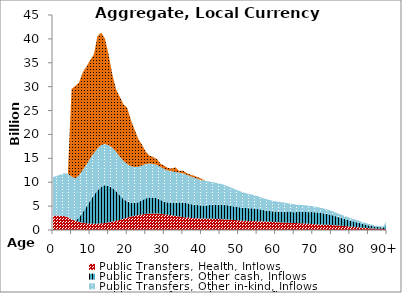
| Category | Public Transfers, Health, Inflows | Public Transfers, Other cash, Inflows | Public Transfers, Other in-kind, Inflows | Public Transfers, Education, Inflows |
|---|---|---|---|---|
| 0 | 2989.538 | 0 | 8076.591 | 0 |
|  | 3045.862 | 0 | 8295.617 | 0 |
| 2 | 2986.964 | 0 | 8597.772 | 0 |
| 3 | 2911.847 | 0 | 8972.659 | 0 |
| 4 | 2665.38 | 0 | 9103.258 | 0 |
| 5 | 2264.519 | 0 | 8928.519 | 18321.145 |
| 6 | 1942.491 | 0 | 8818.268 | 19393.945 |
| 7 | 1706.278 | 909.482 | 8819.917 | 19420.432 |
| 8 | 1529 | 2177.37 | 8828.475 | 20431.437 |
| 9 | 1402.199 | 3469.229 | 8818.626 | 20511.941 |
| 10 | 1334.735 | 4778.48 | 8816.332 | 20595.752 |
| 11 | 1308.325 | 5992.092 | 8811.059 | 20595.918 |
| 12 | 1327.24 | 6985.785 | 8785.427 | 23517.156 |
| 13 | 1378.922 | 7676.193 | 8722.115 | 23543.356 |
| 14 | 1467.943 | 7914.539 | 8621.306 | 22049.767 |
| 15 | 1595.076 | 7635.145 | 8511.974 | 18932.405 |
| 16 | 1754.315 | 7052.954 | 8397.804 | 15318.554 |
| 17 | 1929.582 | 6178.789 | 8260.609 | 13057.727 |
| 18 | 2127.714 | 5134.555 | 8105.971 | 12511.415 |
| 19 | 2352.61 | 4126.587 | 7959.031 | 11850.499 |
| 20 | 2597.571 | 3377.774 | 7823.955 | 11771.6 |
| 21 | 2808.693 | 2855.91 | 7686.877 | 9657.676 |
| 22 | 2987.736 | 2652.896 | 7549.543 | 7788.917 |
| 23 | 3137.498 | 2689.907 | 7412.293 | 5811.376 |
| 24 | 3261.164 | 2972.066 | 7285.509 | 4307.403 |
| 25 | 3370.836 | 3243.557 | 7178.519 | 2601.033 |
| 26 | 3443.195 | 3381.647 | 7092.829 | 1626.287 |
| 27 | 3477.408 | 3309.416 | 7024.235 | 1491.039 |
| 28 | 3464.667 | 3191.698 | 6961.361 | 1207.197 |
| 29 | 3408.647 | 2870.596 | 6888.224 | 705.323 |
| 30 | 3300.628 | 2626.526 | 6797.842 | 728.187 |
| 31 | 3188.32 | 2563.584 | 6689.235 | 539.813 |
| 32 | 3069.059 | 2673.67 | 6560.958 | 568.605 |
| 33 | 2943.778 | 2769.949 | 6413.265 | 1002.561 |
| 34 | 2819.193 | 2937.421 | 6257.36 | 345.068 |
| 35 | 2702.779 | 3034.85 | 6113.26 | 584.765 |
| 36 | 2611.489 | 3002.671 | 5969.347 | 346.66 |
| 37 | 2535.077 | 2896.856 | 5813.191 | 362.519 |
| 38 | 2478.936 | 2825.732 | 5652.678 | 400.887 |
| 39 | 2438.653 | 2768.657 | 5485.483 | 356.274 |
| 40 | 2412.605 | 2730.314 | 5312.767 | 289.129 |
| 41 | 2389.418 | 2730.684 | 5141.258 | 0 |
| 42 | 2365.672 | 2836.242 | 4964.477 | 0 |
| 43 | 2338.997 | 2905.776 | 4781.904 | 0 |
| 44 | 2311.583 | 2964.571 | 4595.731 | 0 |
| 45 | 2281.1 | 3012.708 | 4405.297 | 0 |
| 46 | 2241.126 | 3043.976 | 4211.692 | 0 |
| 47 | 2192.767 | 2985.326 | 4016.781 | 0 |
| 48 | 2138.879 | 2915.952 | 3824.387 | 0 |
| 49 | 2080.763 | 2813.649 | 3636.474 | 0 |
| 50 | 2016.755 | 2766.9 | 3449.859 | 0 |
| 51 | 1960.266 | 2723.779 | 3272.794 | 0 |
| 52 | 1918.722 | 2683.457 | 3111.784 | 0 |
| 53 | 1883.773 | 2660.749 | 2965.091 | 0 |
| 54 | 1859.85 | 2665.129 | 2829.633 | 0 |
| 55 | 1838.81 | 2561.45 | 2699.098 | 0 |
| 56 | 1812.051 | 2464.759 | 2574.07 | 0 |
| 57 | 1779.41 | 2330.026 | 2454.563 | 0 |
| 58 | 1741.063 | 2272.532 | 2340.583 | 0 |
| 59 | 1701.016 | 2214.904 | 2232.008 | 0 |
| 60 | 1656.438 | 2211.788 | 2128.217 | 0 |
| 61 | 1614.363 | 2204.644 | 2028.308 | 0 |
| 62 | 1576.178 | 2272.377 | 1931.271 | 0 |
| 63 | 1536.914 | 2247.312 | 1836.245 | 0 |
| 64 | 1501.281 | 2261.682 | 1743.118 | 0 |
| 65 | 1467.273 | 2262.533 | 1652.31 | 0 |
| 66 | 1430.904 | 2320.304 | 1563.851 | 0 |
| 67 | 1390.404 | 2367.053 | 1477.38 | 0 |
| 68 | 1346.849 | 2430.792 | 1392.828 | 0 |
| 69 | 1299.75 | 2434.805 | 1310.551 | 0 |
| 70 | 1247.661 | 2500.617 | 1230.754 | 0 |
| 71 | 1198.587 | 2486.204 | 1153.395 | 0 |
| 72 | 1155.04 | 2438.776 | 1078.406 | 0 |
| 73 | 1114.604 | 2359.724 | 1005.782 | 0 |
| 74 | 1080.949 | 2267.655 | 935.349 | 0 |
| 75 | 1048.481 | 2102.665 | 866.895 | 0 |
| 76 | 999.359 | 1921.6 | 800.473 | 0 |
| 77 | 939.664 | 1736.236 | 736.503 | 0 |
| 78 | 871.11 | 1567.595 | 675.362 | 0 |
| 79 | 798.19 | 1408.091 | 618.123 | 0 |
| 80 | 720.491 | 1260.186 | 564.803 | 0 |
| 81 | 649.459 | 1130.882 | 514.148 | 0 |
| 82 | 579.979 | 997.904 | 462.513 | 0 |
| 83 | 511.045 | 856.658 | 409.97 | 0 |
| 84 | 448.359 | 725.984 | 360.422 | 0 |
| 85 | 386.643 | 598.921 | 310.81 | 0 |
| 86 | 331.263 | 489.175 | 266.292 | 0 |
| 87 | 289.299 | 404.947 | 232.559 | 0 |
| 88 | 257.032 | 342.106 | 206.62 | 0 |
| 89 | 229.02 | 289.453 | 184.102 | 0 |
| 90+ | 199.992 | 1055.319 | 815.463 | 0 |